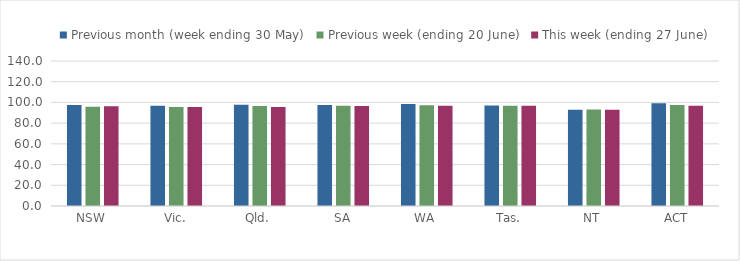
| Category | Previous month (week ending 30 May) | Previous week (ending 20 June) | This week (ending 27 June) |
|---|---|---|---|
| NSW | 97.493 | 95.94 | 96.316 |
| Vic. | 96.829 | 95.472 | 95.549 |
| Qld. | 97.813 | 96.547 | 95.62 |
| SA | 97.552 | 96.882 | 96.436 |
| WA | 98.53 | 97.257 | 96.694 |
| Tas. | 96.965 | 96.75 | 96.75 |
| NT | 93.024 | 93.085 | 92.91 |
| ACT | 99.25 | 97.509 | 96.847 |